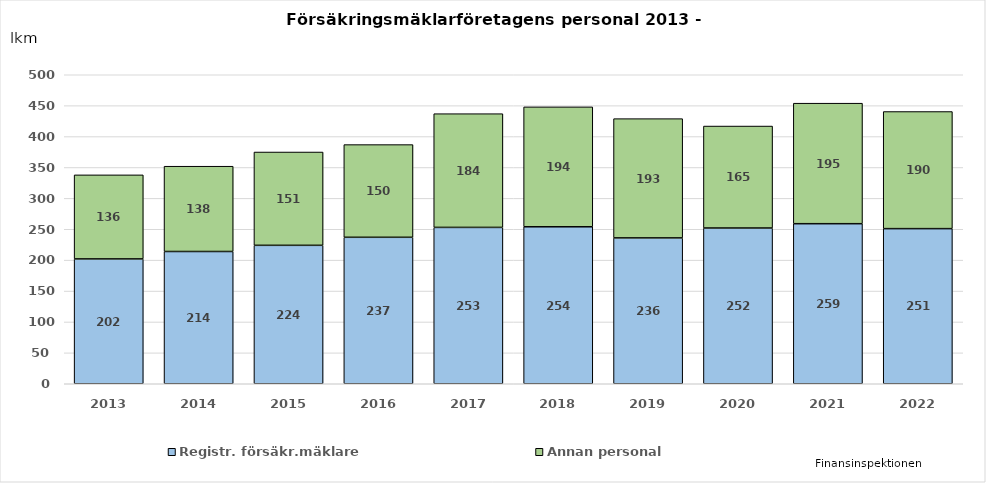
| Category | Registr. försäkr.mäklare | Annan personal |
|---|---|---|
| 2013.0 | 202 | 136 |
| 2014.0 | 214 | 138 |
| 2015.0 | 224 | 151 |
| 2016.0 | 237 | 150 |
| 2017.0 | 253 | 184 |
| 2018.0 | 254 | 194 |
| 2019.0 | 236 | 193 |
| 2020.0 | 252 | 165 |
| 2021.0 | 259 | 195 |
| 2022.0 | 251 | 189.5 |